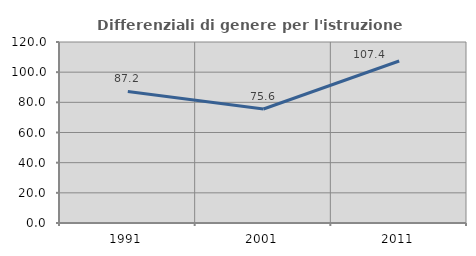
| Category | Differenziali di genere per l'istruzione superiore |
|---|---|
| 1991.0 | 87.184 |
| 2001.0 | 75.572 |
| 2011.0 | 107.391 |